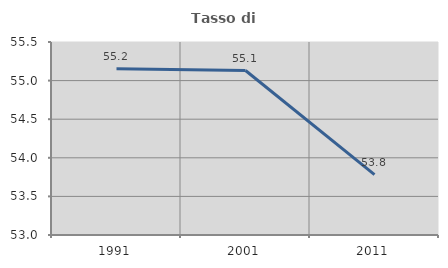
| Category | Tasso di occupazione   |
|---|---|
| 1991.0 | 55.152 |
| 2001.0 | 55.13 |
| 2011.0 | 53.782 |